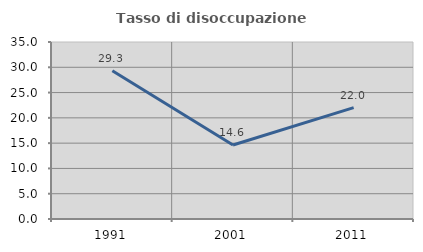
| Category | Tasso di disoccupazione giovanile  |
|---|---|
| 1991.0 | 29.307 |
| 2001.0 | 14.641 |
| 2011.0 | 22.011 |